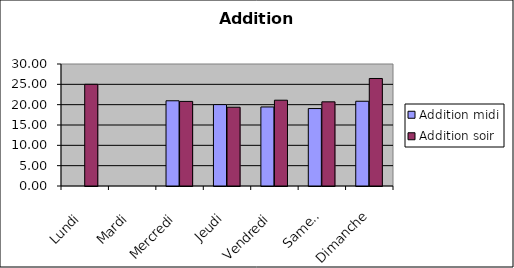
| Category | Addition |
|---|---|
| Lundi | 25.004 |
| Mardi | 0 |
| Mercredi | 20.8 |
| Jeudi | 19.37 |
| Vendredi | 21.098 |
| Samedi | 20.695 |
| Dimanche | 26.438 |